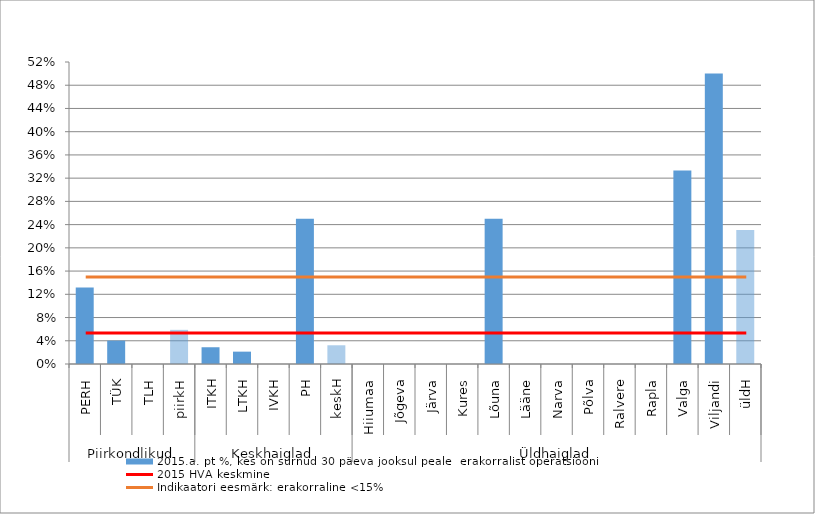
| Category | 2015.a. pt %, kes on surnud 30 päeva jooksul peale  erakorralist operatsiooni |
|---|---|
| 0 | 0.132 |
| 1 | 0.04 |
| 2 | 0 |
| 3 | 0.059 |
| 4 | 0.029 |
| 5 | 0.021 |
| 6 | 0 |
| 7 | 0.25 |
| 8 | 0.032 |
| 9 | 0 |
| 10 | 0 |
| 11 | 0 |
| 12 | 0 |
| 13 | 0.25 |
| 14 | 0 |
| 15 | 0 |
| 16 | 0 |
| 17 | 0 |
| 18 | 0 |
| 19 | 0.333 |
| 20 | 0.5 |
| 21 | 0.231 |